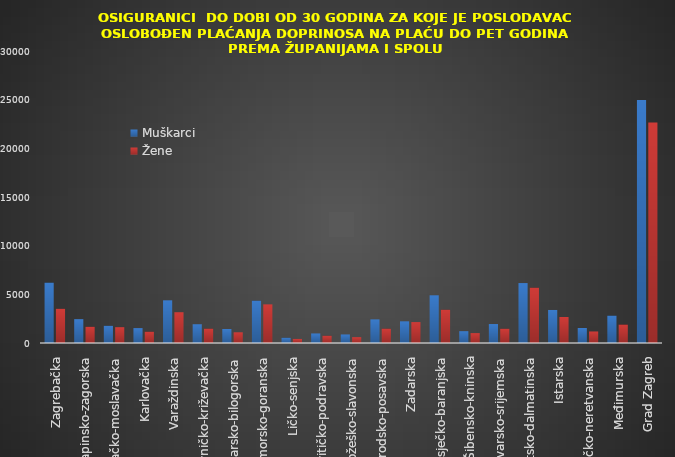
| Category | Muškarci | Žene |
|---|---|---|
| Zagrebačka | 6206 | 3518 |
| Krapinsko-zagorska | 2451 | 1669 |
| Sisačko-moslavačka | 1770 | 1625 |
| Karlovačka | 1532 | 1162 |
| Varaždinska | 4386 | 3163 |
| Koprivničko-križevačka | 1929 | 1480 |
| Bjelovarsko-bilogorska | 1441 | 1100 |
| Primorsko-goranska | 4354 | 3970 |
| Ličko-senjska | 543 | 420 |
| Virovitičko-podravska | 981 | 750 |
| Požeško-slavonska | 878 | 600 |
| Brodsko-posavska | 2428 | 1480 |
| Zadarska | 2227 | 2149 |
| Osječko-baranjska | 4902 | 3422 |
| Šibensko-kninska | 1215 | 1018 |
| Vukovarsko-srijemska | 1949 | 1467 |
| Splitsko-dalmatinska | 6158 | 5685 |
| Istarska | 3395 | 2670 |
| Dubrovačko-neretvanska | 1539 | 1185 |
| Međimurska | 2815 | 1899 |
| Grad Zagreb | 24976 | 22657 |